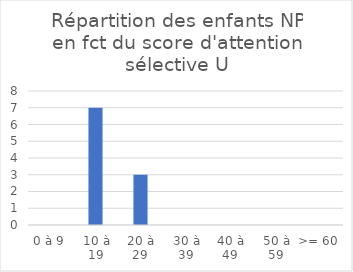
| Category | Series 0 |
|---|---|
| 0 à 9 | 0 |
| 10 à 19 | 7 |
| 20 à 29 | 3 |
| 30 à 39 | 0 |
| 40 à 49 | 0 |
| 50 à 59 | 0 |
| >= 60 | 0 |